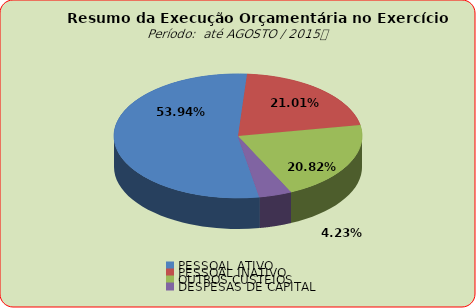
| Category | Series 0 |
|---|---|
| PESSOAL ATIVO | 82999209.79 |
| PESSOAL INATIVO | 32324514.19 |
| OUTROS CUSTEIOS | 32040558.83 |
| DESPESAS DE CAPITAL | 6514760.88 |